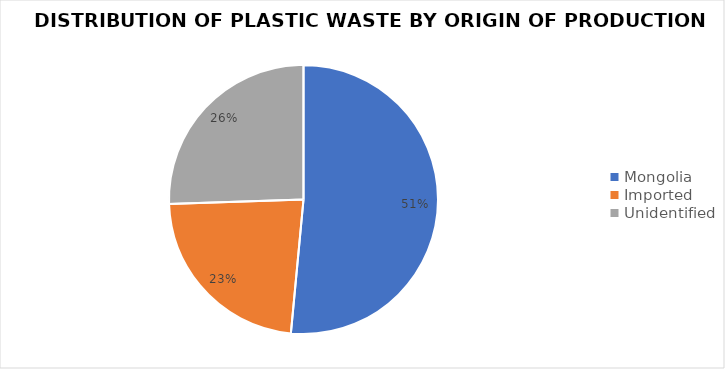
| Category | Series 0 |
|---|---|
| Mongolia | 6984 |
| Imported | 3115 |
| Unidentified | 3463 |